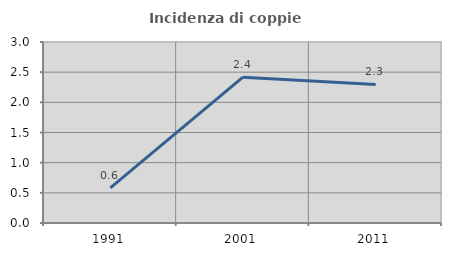
| Category | Incidenza di coppie miste |
|---|---|
| 1991.0 | 0.584 |
| 2001.0 | 2.416 |
| 2011.0 | 2.297 |